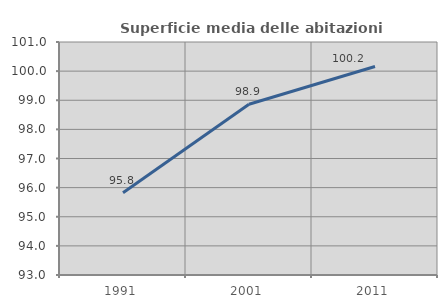
| Category | Superficie media delle abitazioni occupate |
|---|---|
| 1991.0 | 95.827 |
| 2001.0 | 98.862 |
| 2011.0 | 100.16 |